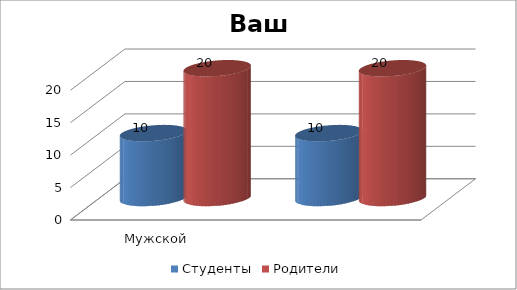
| Category | Студенты | Родители |
|---|---|---|
| Мужской | 10 | 20 |